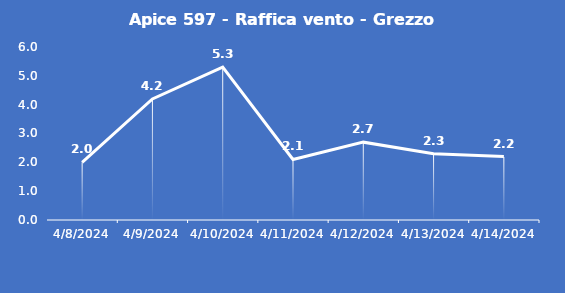
| Category | Apice 597 - Raffica vento - Grezzo (m/s) |
|---|---|
| 4/8/24 | 2 |
| 4/9/24 | 4.2 |
| 4/10/24 | 5.3 |
| 4/11/24 | 2.1 |
| 4/12/24 | 2.7 |
| 4/13/24 | 2.3 |
| 4/14/24 | 2.2 |